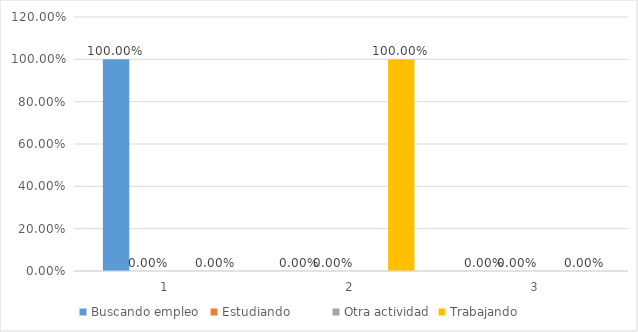
| Category | Buscando empleo  | Estudiando          | Otra actividad | Trabajando          |
|---|---|---|---|---|
| 0 | 1 | 0 | 0 | 0 |
| 1 | 0 | 0 | 0 | 1 |
| 2 | 0 | 0 | 0 | 0 |